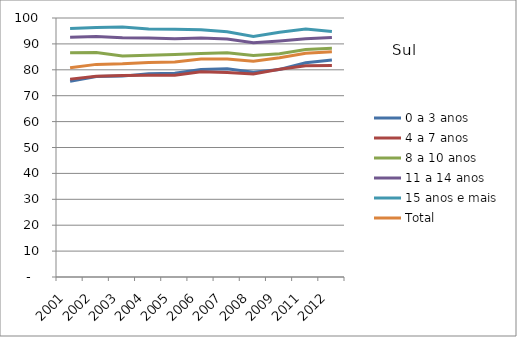
| Category | 0 a 3 anos | 4 a 7 anos | 8 a 10 anos | 11 a 14 anos | 15 anos e mais | Total |
|---|---|---|---|---|---|---|
| 2001.0 | 75.6 | 76.4 | 86.62 | 92.53 | 95.99 | 80.75 |
| 2002.0 | 77.4 | 77.54 | 86.66 | 92.83 | 96.33 | 82.09 |
| 2003.0 | 77.56 | 77.76 | 85.32 | 92.38 | 96.55 | 82.3 |
| 2004.0 | 78.45 | 77.89 | 85.59 | 92.3 | 95.76 | 82.81 |
| 2005.0 | 78.71 | 77.91 | 85.91 | 91.95 | 95.65 | 83.04 |
| 2006.0 | 80.15 | 79.21 | 86.25 | 92.26 | 95.45 | 84.14 |
| 2007.0 | 80.36 | 78.91 | 86.54 | 91.92 | 94.67 | 84.15 |
| 2008.0 | 79.03 | 78.34 | 85.57 | 90.41 | 92.86 | 83.31 |
| 2009.0 | 80.13 | 80.22 | 86.2 | 91.14 | 94.53 | 84.63 |
| 2011.0 | 82.7 | 81.6 | 87.82 | 91.96 | 95.74 | 86.41 |
| 2012.0 | 83.75 | 81.63 | 88.28 | 92.48 | 94.76 | 86.93 |